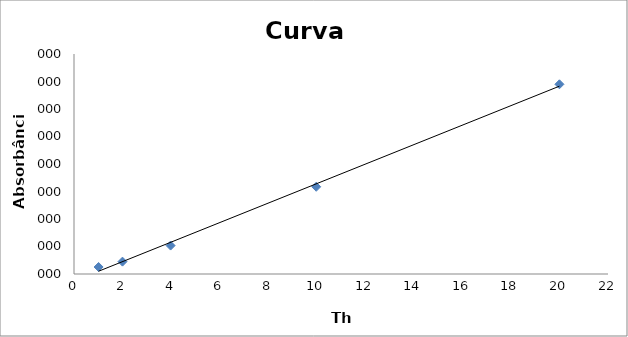
| Category | Series 0 |
|---|---|
| 1.0131013 | 0.013 |
| 1.9971997000000001 | 0.022 |
| 3.979005 | 0.052 |
| 9.9795045 | 0.159 |
| 19.998999 | 0.345 |